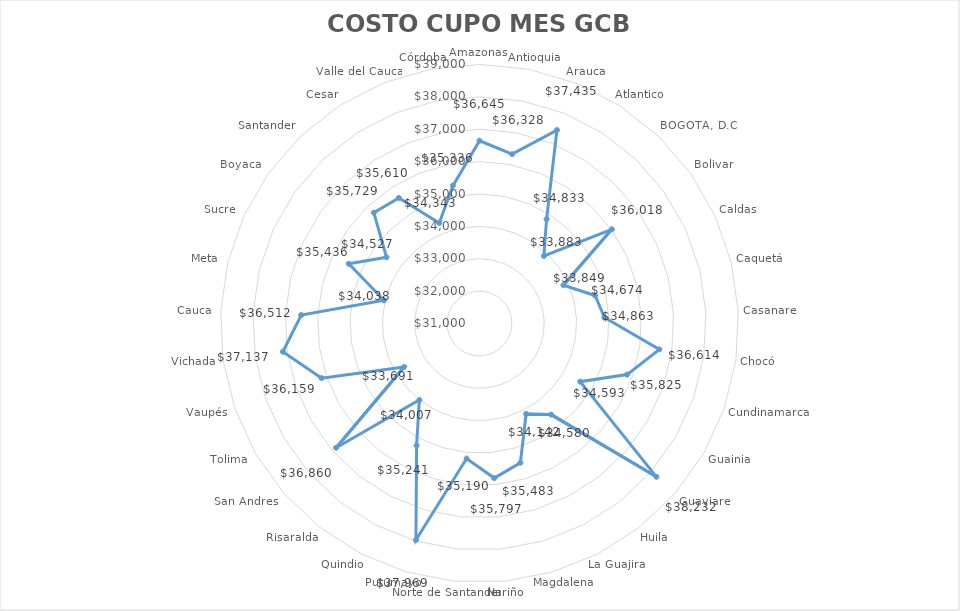
| Category | Series 0 |
|---|---|
| Amazonas | 36645.101 |
| Antioquia | 36328.187 |
| Arauca | 37435.333 |
| Atlantico | 34832.506 |
| BOGOTA, D.C. | 33883.319 |
| Bolivar | 36017.554 |
| Caldas | 33849.18 |
| Caquetá | 34674.108 |
| Casanare | 34863.354 |
| Chocó | 36613.955 |
| Cundinamarca | 35824.634 |
| Guainia | 34592.643 |
| Guaviare | 38231.696 |
| Huila | 34579.998 |
| La Guajira | 34141.795 |
| Magdalena | 35483.183 |
| Nariño | 35796.862 |
| Norte de Santander | 35190.264 |
| Putumayo | 37968.608 |
| Quindio | 35241.112 |
| Risaralda | 34006.789 |
| San Andres | 36860.431 |
| Tolima | 33691.017 |
| Vaupés | 36159.278 |
| Vichada | 37136.931 |
| Cauca | 36512.198 |
| Meta | 34037.557 |
| Sucre | 35436.455 |
| Boyaca | 34526.632 |
| Santander | 35728.933 |
| Cesar | 35609.821 |
| Valle del Cauca | 34342.779 |
| Córdoba | 35335.95 |